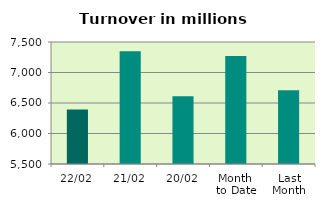
| Category | Series 0 |
|---|---|
| 22/02 | 6393.437 |
| 21/02 | 7348.661 |
| 20/02 | 6609.72 |
| Month 
to Date | 7269.952 |
| Last
Month | 6707.699 |